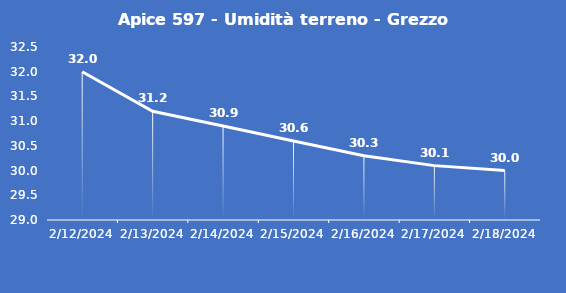
| Category | Apice 597 - Umidità terreno - Grezzo (%VWC) |
|---|---|
| 2/12/24 | 32 |
| 2/13/24 | 31.2 |
| 2/14/24 | 30.9 |
| 2/15/24 | 30.6 |
| 2/16/24 | 30.3 |
| 2/17/24 | 30.1 |
| 2/18/24 | 30 |